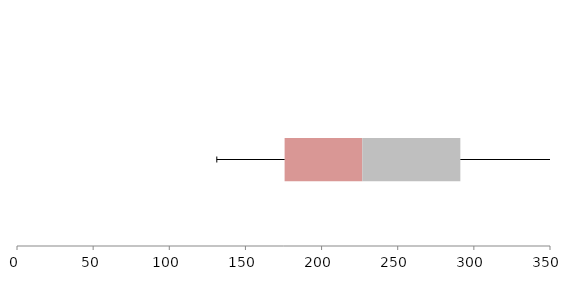
| Category | Series 1 | Series 2 | Series 3 |
|---|---|---|---|
| 0 | 175.727 | 51.012 | 64.381 |